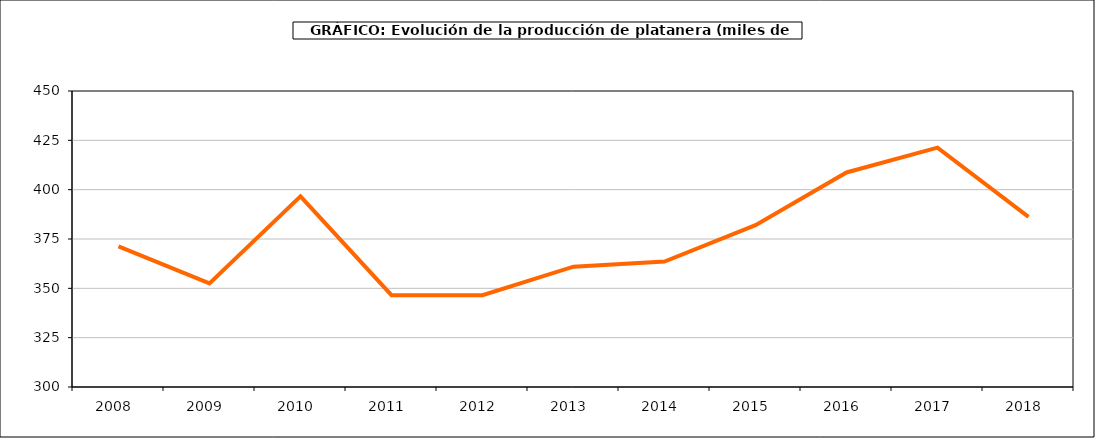
| Category | producción platanera |
|---|---|
| 2008.0 | 371.228 |
| 2009.0 | 352.522 |
| 2010.0 | 396.589 |
| 2011.0 | 346.509 |
| 2012.0 | 346.509 |
| 2013.0 | 360.987 |
| 2014.0 | 363.552 |
| 2015.0 | 381.983 |
| 2016.0 | 408.716 |
| 2017.0 | 421.313 |
| 2018.0 | 386.226 |